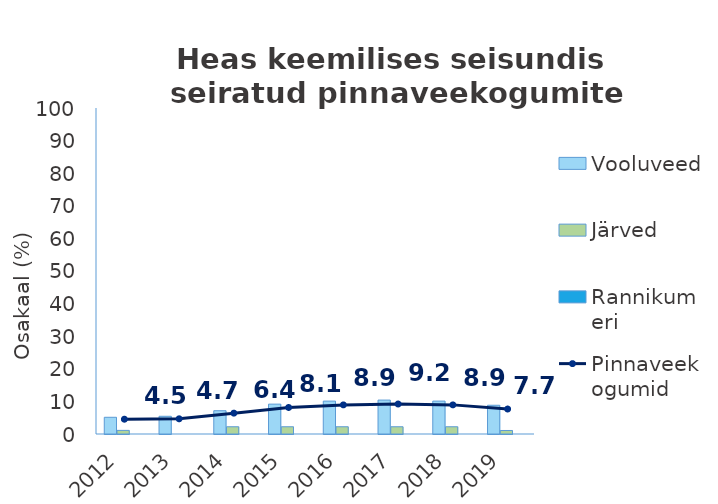
| Category | Vooluveed | Järved | Rannikumeri |
|---|---|---|---|
| 2012.0 | 5.124 | 1.111 | 0 |
| 2013.0 | 5.435 | 0 | 0 |
| 2014.0 | 7.143 | 2.222 | 0 |
| 2015.0 | 9.161 | 2.222 | 0 |
| 2016.0 | 10.093 | 2.222 | 0 |
| 2017.0 | 10.404 | 2.222 | 0 |
| 2018.0 | 10.093 | 2.222 | 0 |
| 2019.0 | 8.819 | 1.075 | 0 |